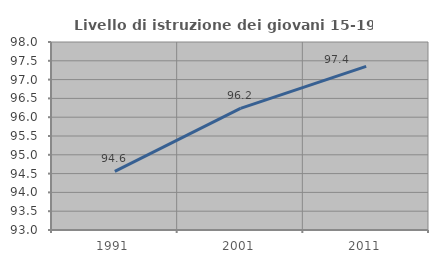
| Category | Livello di istruzione dei giovani 15-19 anni |
|---|---|
| 1991.0 | 94.559 |
| 2001.0 | 96.233 |
| 2011.0 | 97.353 |